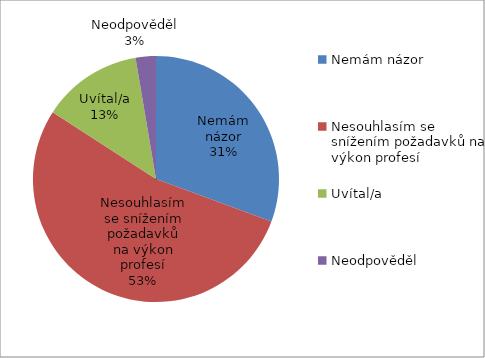
| Category | Series 0 |
|---|---|
| Nemám názor | 253 |
| Nesouhlasím se snížením požadavků na výkon profesí | 442 |
| Uvítal/a | 109 |
| Neodpověděl | 22 |